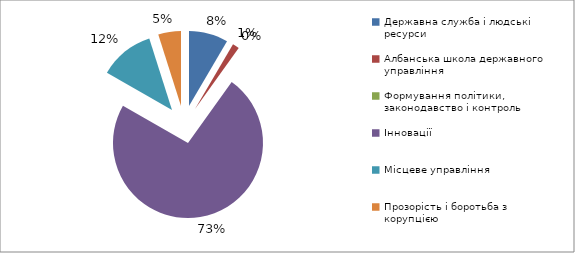
| Category | Series 0 |
|---|---|
| Державна служба і людські ресурси | 5819425 |
| Албанська школа державного управління | 989131 |
| Формування політики, законодавство і контроль | 0 |
| Інновації | 50483328 |
| Місцеве управління | 8127900 |
| Прозорість і боротьба з корупцією  | 3372150 |